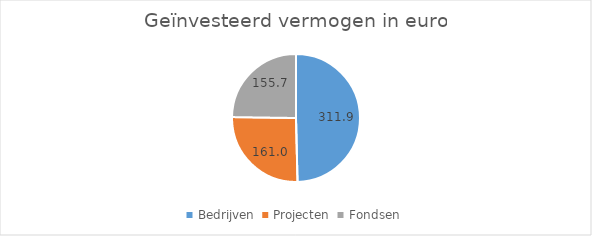
| Category | Series 0 |
|---|---|
| Bedrijven  | 311.864 |
| Projecten  | 160.979 |
| Fondsen | 155.706 |